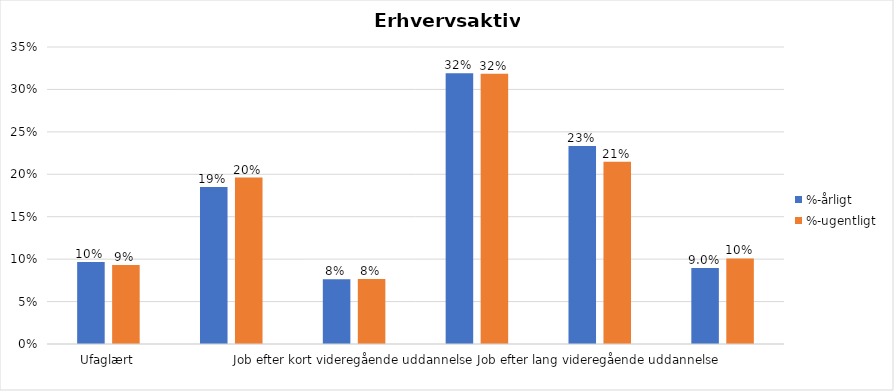
| Category | %-årligt | %-ugentligt |
|---|---|---|
| Ufaglært | 0.097 | 0.093 |
| Erhvervsfagligt job | 0.185 | 0.196 |
| Job efter kort videregående uddannelse | 0.076 | 0.076 |
| Job efter mellemlang videregående uddannelse | 0.319 | 0.319 |
| Job efter lang videregående uddannelse | 0.233 | 0.215 |
| Selvstændig | 0.09 | 0.101 |